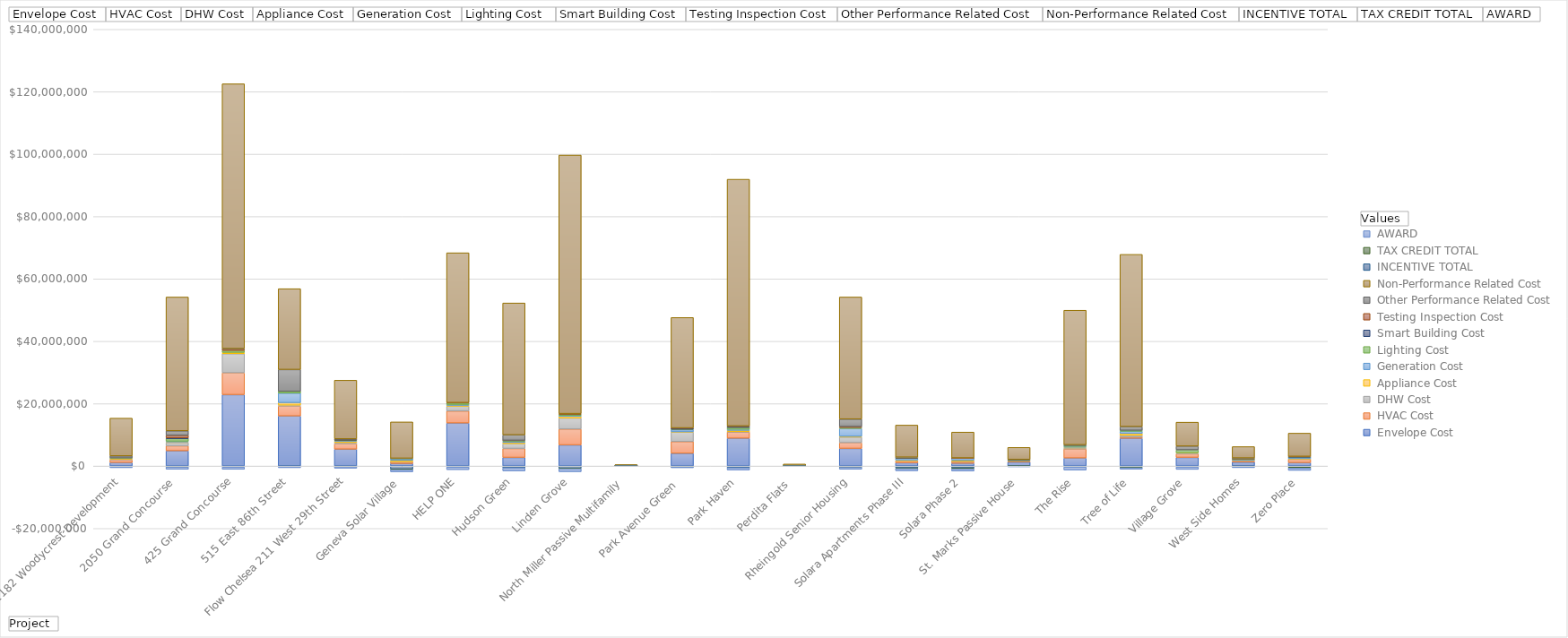
| Category |  Envelope Cost |  HVAC Cost |  DHW Cost |  Appliance Cost |  Generation Cost |  Lighting Cost  |  Smart Building Cost |  Testing Inspection Cost |  Other Performance Related Cost |  Non-Performance Related Cost |  INCENTIVE TOTAL |  TAX CREDIT TOTAL |  AWARD |
|---|---|---|---|---|---|---|---|---|---|---|---|---|---|
| 1182 Woodycrest Development | 1130801.59 | 879051 | 240000 | 140736 | 0 | 200000 | 0 | 0 | 645948 | 12128463.81 | -169700 | 0 | -350931 |
| 2050 Grand Concourse  | 4894107.228 | 1592848.164 | 1059435.67 | 183414 | 239102.25 | 807248.033 | 270000 | 789125 | 1454119.25 | 42899731.587 | -235624 | -55599 | -750000 |
| 425 Grand Concourse | 22898351.84 | 6998906 | 6106206 | 434701 | 0 | 617156 | 0 | 546700 | 50300 | 84887679.16 | -300000 | 0 | -750000 |
| 515 East 86th Street  | 16052777 | 3168000 | 307000 | 788116 | 3072683 | 553272 | 0 | 0 | 7001039.706 | 25917381.706 | -99617.8 | 0 | -425000 |
| Flow Chelsea 211 West 29th Street | 5414207.77 | 1755748.5 | 356582 | 462963.94 | 157000 | 246715.67 | 50000 | 53050 | 198249.76 | 18820784.21 | -145660 | -49394 | -500000 |
| Geneva Solar Village | 823994 | 520783 | 73950 | 410325 | 571158 | 41511 | 0 | 0 | 64637.931 | 11648847 | -978000 | -140885 | -727236 |
| HELP ONE | 13796154 | 3860000 | 1521600 | 291269 | 263398 | 468693 | 0 | 142906 | 0 | 48027048 | -300000 | 0 | -850000 |
| Hudson Green | 2761816 | 2870000 | 1545000 | 372200 | 411400 | 260000 | 0 | 37000 | 1742800 | 42282722 | -555000 | 0 | -1000000 |
| Linden Grove | 6779865.441 | 5074592.04 | 3559889.291 | 572717.547 | 232500 | 400000 | 0 | 189900 | 0 | 82895592.98 | -700000 | -100000 | -1000000 |
| North Miller Passive Multifamily | 96977.91 | 8539.65 | 5400 | 7000 | 27815 | 2147.13 | 2300 | 7650 | 5000 | 289777.66 | -12600 | -14255 | -39467 |
| Park Avenue Green  | 4079691.16 | 3770484.94 | 3048214.42 | 63526 | 682830 | 141119.7 | 365000 | 73675 | 0 | 35399236.42 | -270600 | -20400 | -250000 |
| Park Haven | 8918168 | 2028100 | 91500 | 404336 | 339261 | 590723 | 350000 | 45775 | 100000 | 79083917 | -508200 | 0 | -750000 |
| Perdita Flats  | 64925.8 | 30000 | 12400 | 21000 | 34600 | 750 | 0 | 0 | 0 | 500484.2 | -6400 | -14933 | -59976 |
| Rheingold Senior Housing | 5651719.02 | 1830400 | 1791250 | 239216.96 | 2535918.75 | 294500 | 0 | 310000 | 2405000 | 39136690.99 | -339240 | -52250 | -637500 |
| Solara Apartments Phase III | 1057815 | 575523 | 60000 | 233256 | 678000 | 51000 | 45000 | 22372 | 131321 | 10287092 | -558250 | -199800 | -750000 |
| Solara Phase 2 | 884237 | 575523 | 60000 | 299400 | 678000 | 51000 | 45000 | 20826 | 0 | 8280460 | -571050 | -283035 | -750000 |
| St. Marks Passive House | 1286500 | 275000 | 105000 | 120000 | 40000 | 80000 | 0 | 0 | 186730 | 3887850 | -13608 | -29906 | -203082 |
| The Rise | 2579052 | 2922400 | 300000 | 212800 | 273845 | 280000 | 0 | 0 | 260966 | 43128939.45 | -279680 | 0 | -1000000 |
| Tree of Life | 8908493.25 | 366127.83 | 575000 | 625000 | 679194.51 | 300000 | 0 | 0 | 1195947.3 | 55205071.24 | -320000 | -185526 | -500000 |
| Village Grove | 2770500 | 1174200 | 320280 | 30642.95 | 0 | 888684 | 0 | 0 | 1189475 | 7697481.89 | -274000 | 0 | -792438 |
| West Side Homes | 1283405.21 | 415414.84 | 213378.98 | 32298.56 | 119136.74 | 301510.08 | 0 | 500 | 224844.694 | 3646134.94 | -115819 | -27878 | -362620 |
| Zero Place | 1101500 | 1100000 | 50000 | 110630 | 475000 | 10000 | 215000 | 45000 | 0 | 7440183 | -315040 | -313400 | -750000 |